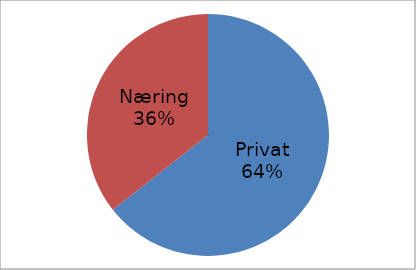
| Category | Series 0 |
|---|---|
| Privat | 39489473 |
| Næring | 21821322 |